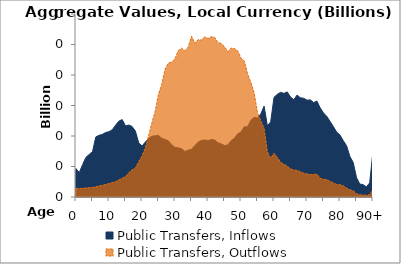
| Category | Public Transfers, Inflows | Public Transfers, Outflows |
|---|---|---|
| 0 | 46.385 | 14.009 |
|  | 40.101 | 13.811 |
| 2 | 53.199 | 14.13 |
| 3 | 64.958 | 14.894 |
| 4 | 69.749 | 15.221 |
| 5 | 74.246 | 15.724 |
| 6 | 98.482 | 16.737 |
| 7 | 101.159 | 18.188 |
| 8 | 102.645 | 19.268 |
| 9 | 105.806 | 20.49 |
| 10 | 107.079 | 22 |
| 11 | 110.343 | 23.599 |
| 12 | 117.824 | 25.099 |
| 13 | 124.398 | 28.132 |
| 14 | 126.953 | 30.753 |
| 15 | 116.556 | 33.461 |
| 16 | 117.973 | 39.751 |
| 17 | 115.587 | 44.491 |
| 18 | 108.113 | 47.724 |
| 19 | 88.897 | 57.679 |
| 20 | 83.631 | 67.151 |
| 21 | 90.037 | 80.268 |
| 22 | 95.961 | 100.38 |
| 23 | 99.651 | 121.597 |
| 24 | 100.428 | 140.578 |
| 25 | 100.986 | 168.563 |
| 26 | 96.002 | 185.041 |
| 27 | 94.377 | 209.672 |
| 28 | 91.971 | 219.492 |
| 29 | 85.79 | 221.189 |
| 30 | 81.235 | 226.655 |
| 31 | 80.516 | 240.122 |
| 32 | 79.172 | 243.98 |
| 33 | 74.659 | 239.699 |
| 34 | 76.676 | 245.697 |
| 35 | 78.207 | 263.611 |
| 36 | 84.022 | 252.174 |
| 37 | 89.969 | 257.976 |
| 38 | 92.625 | 257.365 |
| 39 | 93.481 | 262.652 |
| 40 | 92.412 | 259.75 |
| 41 | 94.027 | 262.825 |
| 42 | 93.505 | 261.657 |
| 43 | 88.868 | 253.24 |
| 44 | 87.185 | 251.7 |
| 45 | 84.362 | 246.338 |
| 46 | 85.181 | 238.261 |
| 47 | 92.386 | 244.103 |
| 48 | 96.131 | 243.477 |
| 49 | 103.675 | 239.547 |
| 50 | 106.505 | 227.502 |
| 51 | 114.999 | 223.027 |
| 52 | 114.998 | 201.657 |
| 53 | 125.907 | 187.575 |
| 54 | 130.532 | 170.375 |
| 55 | 129.523 | 138.106 |
| 56 | 136.148 | 124.842 |
| 57 | 148.913 | 112.275 |
| 58 | 116.569 | 74.097 |
| 59 | 123.194 | 63.487 |
| 60 | 163.338 | 71.626 |
| 61 | 168.32 | 65.118 |
| 62 | 171.614 | 56.96 |
| 63 | 169.872 | 53.391 |
| 64 | 172.299 | 50.642 |
| 65 | 163.949 | 46.159 |
| 66 | 159.537 | 44.125 |
| 67 | 167.142 | 43.626 |
| 68 | 162.625 | 41.288 |
| 69 | 161.867 | 38.908 |
| 70 | 158.719 | 37.814 |
| 71 | 159.266 | 36.745 |
| 72 | 154.801 | 36.774 |
| 73 | 157.278 | 37.446 |
| 74 | 146.003 | 30.704 |
| 75 | 137.786 | 28.979 |
| 76 | 132.179 | 28.416 |
| 77 | 123.854 | 25.552 |
| 78 | 115.43 | 22.919 |
| 79 | 106.252 | 20.39 |
| 80 | 101.545 | 20.075 |
| 81 | 92.356 | 18.4 |
| 82 | 83.916 | 14.653 |
| 83 | 66.535 | 11.838 |
| 84 | 56.695 | 10.147 |
| 85 | 31.901 | 5.305 |
| 86 | 21.267 | 3.555 |
| 87 | 20.231 | 3.302 |
| 88 | 16.609 | 2.674 |
| 89 | 23.21 | 3.794 |
| 90+ | 75.129 | 12.201 |